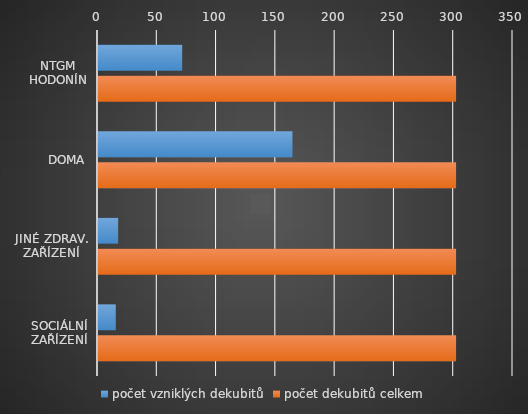
| Category | počet vzniklých dekubitů | počet dekubitů celkem |
|---|---|---|
| NTGM HODONÍN | 71 | 302 |
| DOMA | 164 | 302 |
| JINÉ ZDRAV. ZAŘÍZENÍ | 17 | 302 |
| SOCIÁLNÍ ZAŘÍZENÍ | 15 | 302 |